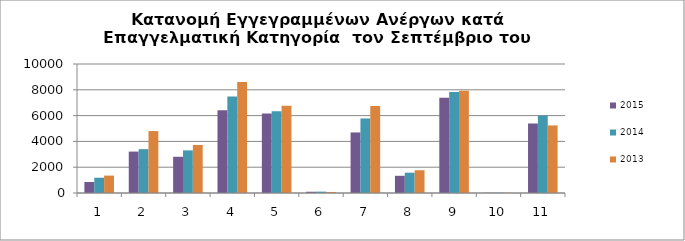
| Category | 2015 | 2014 | 2013 |
|---|---|---|---|
| 1.0 | 854 | 1183 | 1348 |
| 2.0 | 3211 | 3399 | 4802 |
| 3.0 | 2808 | 3304 | 3727 |
| 4.0 | 6414 | 7483 | 8598 |
| 5.0 | 6161 | 6337 | 6768 |
| 6.0 | 98 | 107 | 80 |
| 7.0 | 4695 | 5778 | 6744 |
| 8.0 | 1333 | 1575 | 1766 |
| 9.0 | 7390 | 7827 | 7931 |
| 10.0 | 13 | 19 | 15 |
| 11.0 | 5388 | 6005 | 5238 |